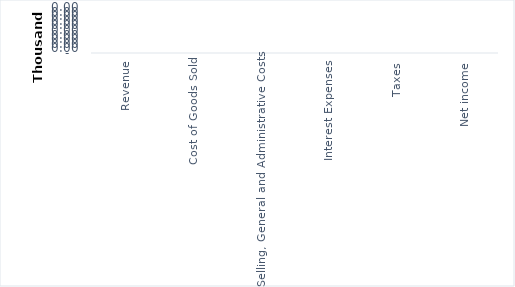
| Category | Series 0 | Series 1 | Series 2 |
|---|---|---|---|
| Revenue | 0 | 0 | 0 |
| Cost of Goods Sold | 0 | 0 | 0 |
| Selling, General and Administrative Costs | 0 | 0 | 0 |
| Interest Expenses | 0 | 0 | 0 |
| Taxes | 0 | 0 | 0 |
| Net income | 0 | 0 | 0 |